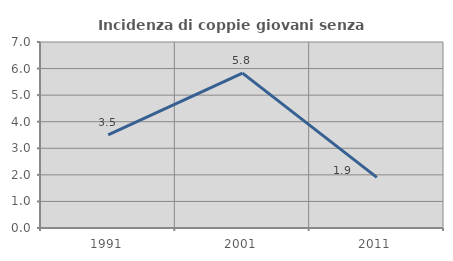
| Category | Incidenza di coppie giovani senza figli |
|---|---|
| 1991.0 | 3.509 |
| 2001.0 | 5.83 |
| 2011.0 | 1.905 |